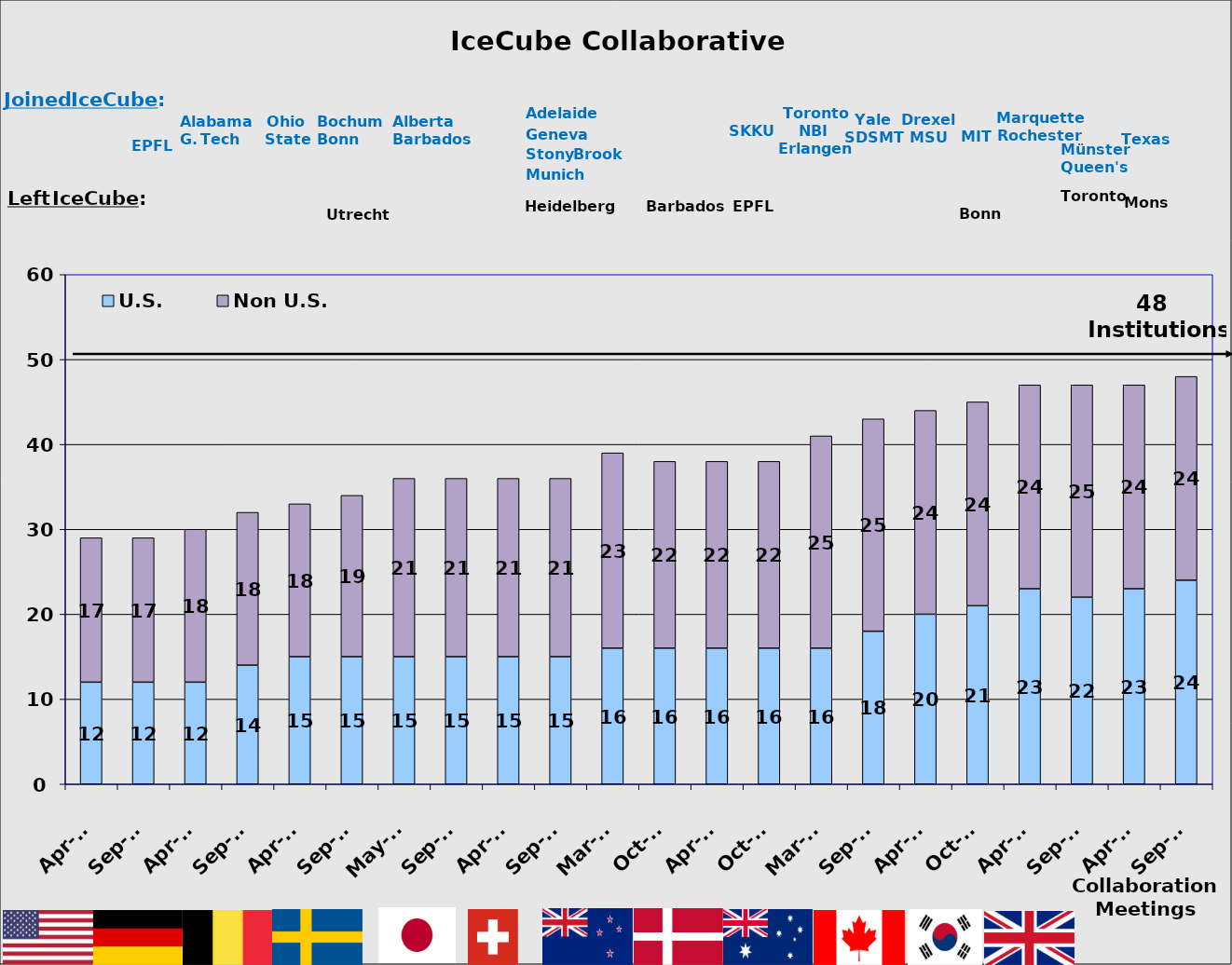
| Category | U.S. | Non U.S. |
|---|---|---|
| Apr-07 | 12 | 17 |
| Sep-07 | 12 | 17 |
| Apr-08 | 12 | 18 |
| Sep-08 | 14 | 18 |
| Apr-09 | 15 | 18 |
| Sep-09 | 15 | 19 |
| May-10 | 15 | 21 |
| Sep-10 | 15 | 21 |
| Apr-11 | 15 | 21 |
| Sep-11 | 15 | 21 |
| Mar-12 | 16 | 23 |
| Oct-12 | 16 | 22 |
| Apr-13 | 16 | 22 |
| Oct-13 | 16 | 22 |
| Mar-14 | 16 | 25 |
| Sep-14 | 18 | 25 |
| Apr-15 | 20 | 24 |
| Oct-15 | 21 | 24 |
| Apr-16 | 23 | 24 |
| Sep-16 | 22 | 25 |
| Apr-17 | 23 | 24 |
| Sep-17 | 24 | 24 |